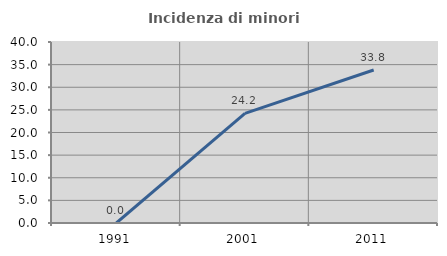
| Category | Incidenza di minori stranieri |
|---|---|
| 1991.0 | 0 |
| 2001.0 | 24.242 |
| 2011.0 | 33.813 |